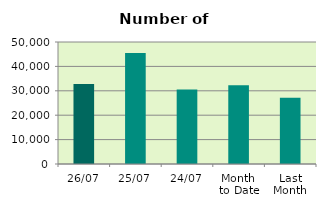
| Category | Series 0 |
|---|---|
| 26/07 | 32742 |
| 25/07 | 45522 |
| 24/07 | 30526 |
| Month 
to Date | 32289.3 |
| Last
Month | 27125.1 |